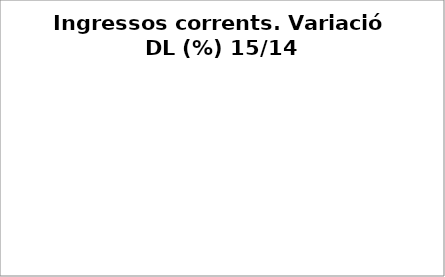
| Category | Series 0 |
|---|---|
| Impostos locals | 0.073 |
| Participació Tributs de l'Estat | 0.015 |
| Taxes i altres ingressos | 0.002 |
| Transferències corrents (exc. FCF) | 0.917 |
| Ingressos patrimonials | 0.359 |
| Ingressos corrents | 0.071 |